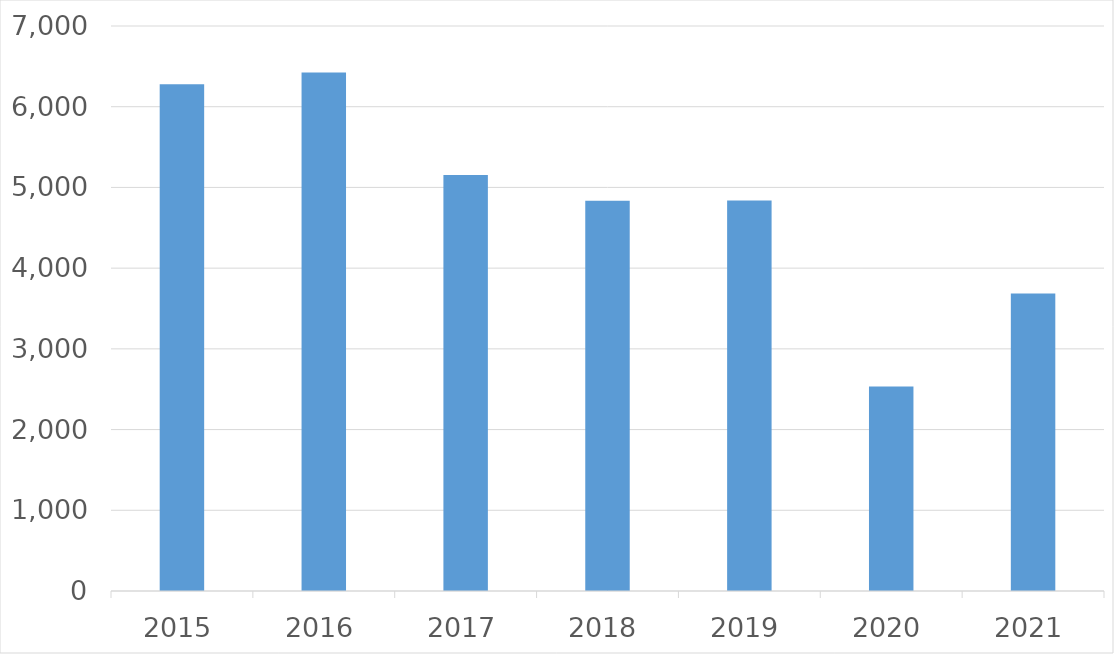
| Category | Series 0 |
|---|---|
| 2015 | 6279 |
| 2016 | 6425 |
| 2017 | 5155 |
| 2018 | 4834 |
| 2019 | 4838 |
| 2020 | 2533 |
| 2021 | 3685 |